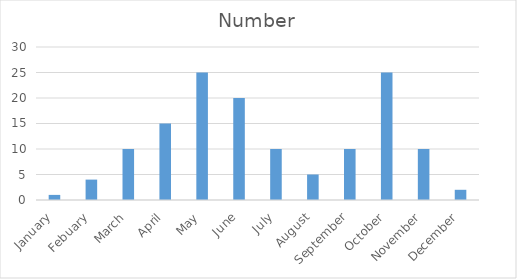
| Category | Number |
|---|---|
| January | 1 |
| Febuary | 4 |
| March | 10 |
| April | 15 |
| May | 25 |
| June | 20 |
| July | 10 |
| August | 5 |
| September | 10 |
| October | 25 |
| November | 10 |
| December | 2 |